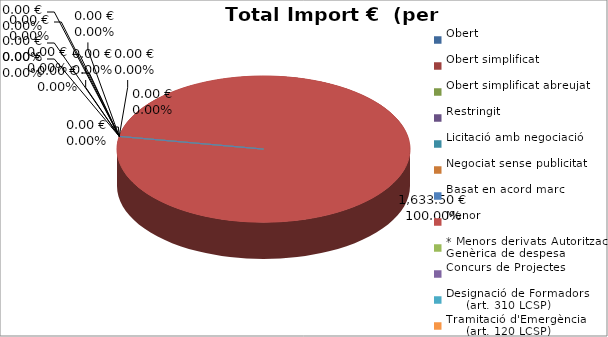
| Category | Total preu
(amb IVA) |
|---|---|
| Obert | 0 |
| Obert simplificat | 0 |
| Obert simplificat abreujat | 0 |
| Restringit | 0 |
| Licitació amb negociació | 0 |
| Negociat sense publicitat | 0 |
| Basat en acord marc | 0 |
| Menor | 1633.5 |
| * Menors derivats Autorització Genèrica de despesa | 0 |
| Concurs de Projectes | 0 |
| Designació de Formadors
     (art. 310 LCSP) | 0 |
| Tramitació d'Emergència
     (art. 120 LCSP) | 0 |